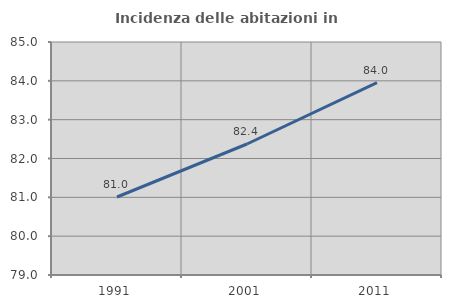
| Category | Incidenza delle abitazioni in proprietà  |
|---|---|
| 1991.0 | 81.009 |
| 2001.0 | 82.373 |
| 2011.0 | 83.952 |